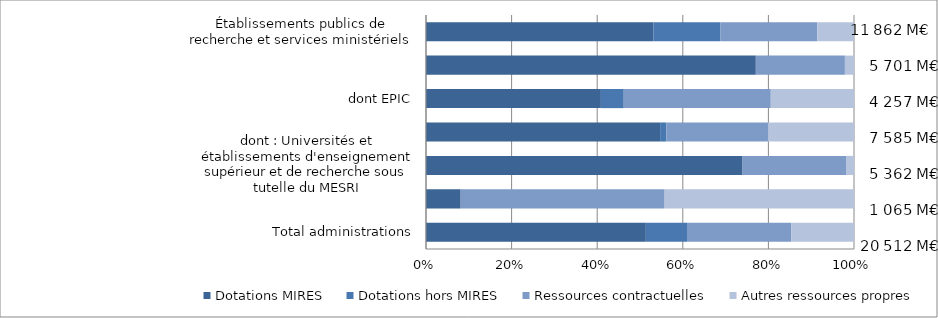
| Category | Dotations MIRES | Dotations hors MIRES | Ressources contractuelles | Autres ressources propres |
|---|---|---|---|---|
| Total administrations | 51.364 | 9.618 | 24.338 | 14.68 |
| Institutions sans but lucratif | 8.102 | 0 | 47.656 | 44.242 |
| dont : Universités et établissements d'enseignement supérieur et de recherche sous tutelle du MESRI | 73.934 | 0.082 | 24.116 | 1.868 |
| Établissements d'enseignement supérieur et de recherche | 54.698 | 1.469 | 23.752 | 20.081 |
| dont EPIC | 40.862 | 5.344 | 34.353 | 19.441 |
| dont EPST (y compris le CNRS) | 77.059 | 0 | 20.817 | 2.124 |
| Établissements publics de recherche et services ministériels | 53.118 | 15.692 | 22.618 | 8.572 |